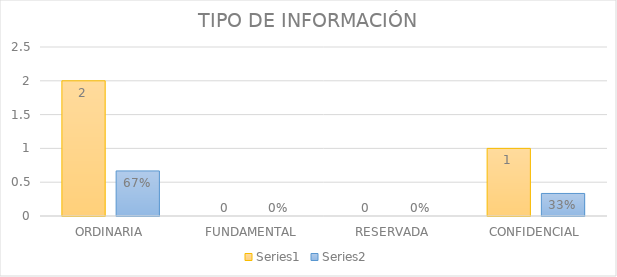
| Category | Series 3 | Series 4 |
|---|---|---|
| ORDINARIA | 2 | 0.667 |
| FUNDAMENTAL | 0 | 0 |
| RESERVADA | 0 | 0 |
| CONFIDENCIAL | 1 | 0.333 |